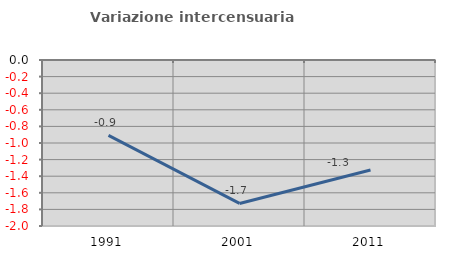
| Category | Variazione intercensuaria annua |
|---|---|
| 1991.0 | -0.909 |
| 2001.0 | -1.728 |
| 2011.0 | -1.325 |